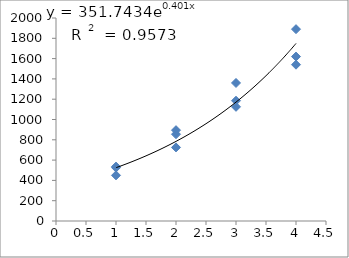
| Category | Series 0 |
|---|---|
| 1.0 | 450 |
| 1.0 | 536 |
| 1.0 | 526 |
| 2.0 | 855 |
| 2.0 | 725 |
| 2.0 | 895 |
| 3.0 | 1125 |
| 3.0 | 1360 |
| 3.0 | 1185 |
| 4.0 | 1620 |
| 4.0 | 1890 |
| 4.0 | 1540 |